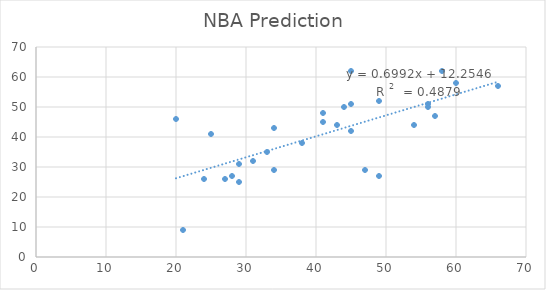
| Category | 2012 |
|---|---|
| 66.0 | 57 |
| 54.0 | 44 |
| 49.0 | 52 |
| 49.0 | 27 |
| 45.0 | 62 |
| 44.0 | 50 |
| 41.0 | 48 |
| 38.0 | 38 |
| 34.0 | 43 |
| 34.0 | 29 |
| 29.0 | 31 |
| 29.0 | 25 |
| 24.0 | 26 |
| 21.0 | 9 |
| 20.0 | 46 |
| 60.0 | 58 |
| 58.0 | 62 |
| 57.0 | 47 |
| 56.0 | 50 |
| 56.0 | 51 |
| 47.0 | 29 |
| 45.0 | 51 |
| 45.0 | 42 |
| 43.0 | 44 |
| 41.0 | 45 |
| 33.0 | 35 |
| 31.0 | 32 |
| 28.0 | 27 |
| 27.0 | 26 |
| 25.0 | 41 |